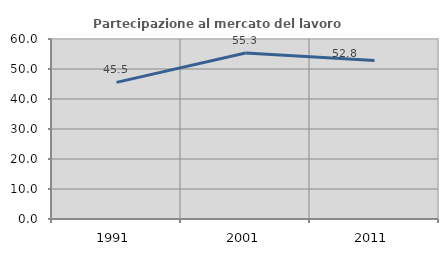
| Category | Partecipazione al mercato del lavoro  femminile |
|---|---|
| 1991.0 | 45.545 |
| 2001.0 | 55.344 |
| 2011.0 | 52.807 |